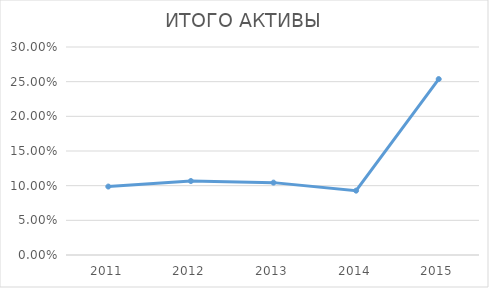
| Category | ИТОГО АКТИВЫ |
|---|---|
| 2011.0 | 0.099 |
| 2012.0 | 0.107 |
| 2013.0 | 0.104 |
| 2014.0 | 0.093 |
| 2015.0 | 0.254 |